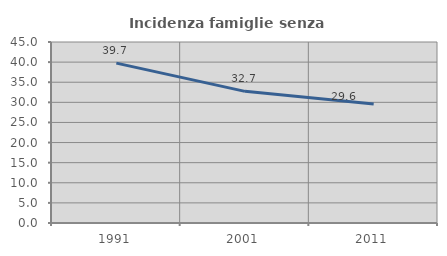
| Category | Incidenza famiglie senza nuclei |
|---|---|
| 1991.0 | 39.744 |
| 2001.0 | 32.727 |
| 2011.0 | 29.609 |